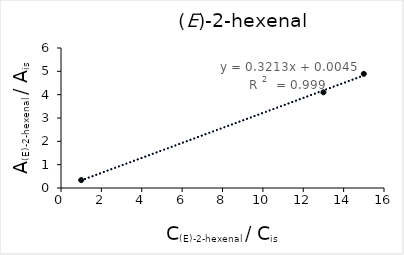
| Category | Series 0 |
|---|---|
| 1.0 | 0.337 |
| 13.0 | 4.101 |
| 15.0 | 4.892 |